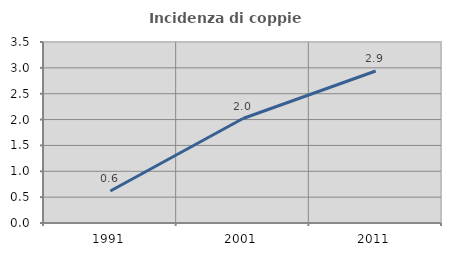
| Category | Incidenza di coppie miste |
|---|---|
| 1991.0 | 0.619 |
| 2001.0 | 2.02 |
| 2011.0 | 2.94 |